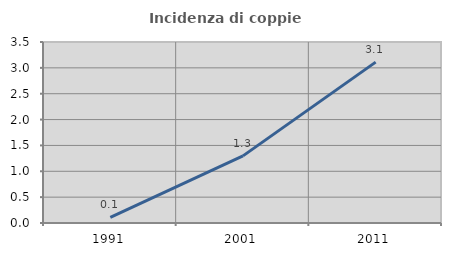
| Category | Incidenza di coppie miste |
|---|---|
| 1991.0 | 0.108 |
| 2001.0 | 1.298 |
| 2011.0 | 3.111 |